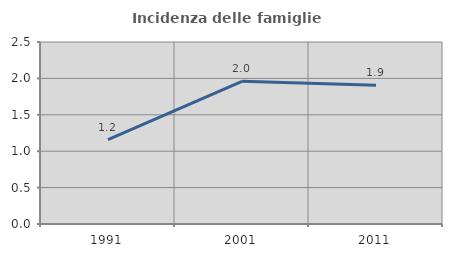
| Category | Incidenza delle famiglie numerose |
|---|---|
| 1991.0 | 1.159 |
| 2001.0 | 1.961 |
| 2011.0 | 1.905 |